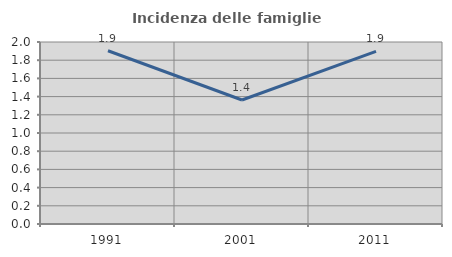
| Category | Incidenza delle famiglie numerose |
|---|---|
| 1991.0 | 1.904 |
| 2001.0 | 1.363 |
| 2011.0 | 1.897 |